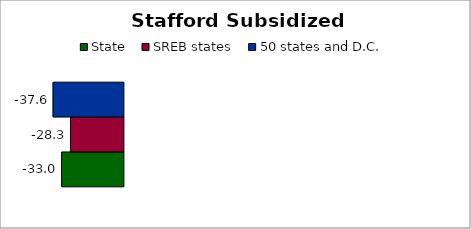
| Category | State | SREB states | 50 states and D.C. |
|---|---|---|---|
| 0 | -33.003 | -28.278 | -37.578 |